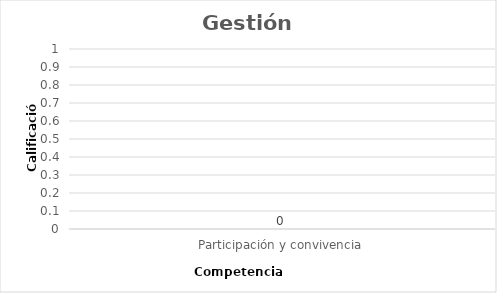
| Category | Series 0 |
|---|---|
| Participación y convivencia | 0 |